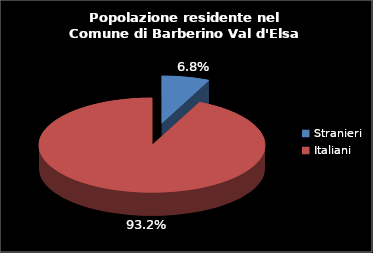
| Category | Series 0 |
|---|---|
| Stranieri | 324 |
| Italiani | 4406 |